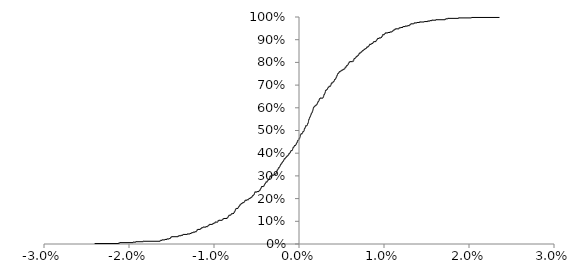
| Category | Series 0 |
|---|---|
| -0.024045713934551387 | 0.002 |
| -0.021190329641883797 | 0.004 |
| -0.021068445774304955 | 0.006 |
| -0.019481577920614893 | 0.008 |
| -0.01918932747459113 | 0.01 |
| -0.01831322585424418 | 0.012 |
| -0.016332640425425756 | 0.014 |
| -0.016269969586518905 | 0.016 |
| -0.01608391495394457 | 0.018 |
| -0.015775249893956705 | 0.02 |
| -0.01551416282012102 | 0.022 |
| -0.015269735575366317 | 0.024 |
| -0.015107295295219942 | 0.026 |
| -0.01510614566841752 | 0.028 |
| -0.015041004402000938 | 0.03 |
| -0.014970447727884563 | 0.032 |
| -0.014224533649371965 | 0.034 |
| -0.014128837425512858 | 0.036 |
| -0.013870625183525734 | 0.038 |
| -0.013659979136269044 | 0.04 |
| -0.013622299642461524 | 0.042 |
| -0.013101706478943017 | 0.044 |
| -0.012830034572842656 | 0.046 |
| -0.01267176406882256 | 0.048 |
| -0.012566487625169893 | 0.05 |
| -0.01239524316375942 | 0.052 |
| -0.012210900198019658 | 0.054 |
| -0.012037461029308916 | 0.056 |
| -0.012019648051448523 | 0.058 |
| -0.011996716287631437 | 0.06 |
| -0.01197246672821949 | 0.062 |
| -0.011894530173388951 | 0.064 |
| -0.01159521725666741 | 0.066 |
| -0.011517896520486468 | 0.068 |
| -0.011472401162236696 | 0.07 |
| -0.011367697100219972 | 0.072 |
| -0.011249528949107652 | 0.074 |
| -0.01094581856639011 | 0.076 |
| -0.010726428311408964 | 0.078 |
| -0.01069142597548092 | 0.08 |
| -0.010644946457490995 | 0.082 |
| -0.010538986044773935 | 0.084 |
| -0.010514023884936914 | 0.086 |
| -0.01015382338334644 | 0.088 |
| -0.01008261276841658 | 0.09 |
| -0.009987598628348417 | 0.092 |
| -0.009844718796764856 | 0.094 |
| -0.009835236504966026 | 0.096 |
| -0.009539280097896391 | 0.098 |
| -0.009533659771738095 | 0.1 |
| -0.009514123288645846 | 0.102 |
| -0.009398497993830787 | 0.104 |
| -0.009026859602507814 | 0.106 |
| -0.008947764498812849 | 0.108 |
| -0.008925364686319017 | 0.11 |
| -0.008852735163293964 | 0.112 |
| -0.008453012512976503 | 0.114 |
| -0.008375827121537857 | 0.116 |
| -0.00835670759098 | 0.118 |
| -0.008310936640576671 | 0.12 |
| -0.008276324422049015 | 0.122 |
| -0.008259633977417033 | 0.124 |
| -0.008212231260027627 | 0.127 |
| -0.008033855079448484 | 0.129 |
| -0.007967587195760756 | 0.131 |
| -0.007942280016678828 | 0.133 |
| -0.007825301090429157 | 0.135 |
| -0.007644462256945859 | 0.137 |
| -0.007637943779572475 | 0.139 |
| -0.007619906037600233 | 0.141 |
| -0.007556351894011646 | 0.143 |
| -0.0075268801302346856 | 0.145 |
| -0.007515170015972768 | 0.147 |
| -0.00748730661607019 | 0.149 |
| -0.007481767585666709 | 0.151 |
| -0.00744044968032026 | 0.153 |
| -0.007411444409454522 | 0.155 |
| -0.007378594656862036 | 0.157 |
| -0.007165841618811403 | 0.159 |
| -0.007128548356520289 | 0.161 |
| -0.00712000159865905 | 0.163 |
| -0.007057290933495905 | 0.165 |
| -0.007026629613306052 | 0.167 |
| -0.0069839491276426175 | 0.169 |
| -0.006968158168866895 | 0.171 |
| -0.006922378445205133 | 0.173 |
| -0.00682544739877283 | 0.175 |
| -0.006812678417506931 | 0.177 |
| -0.006772699622025403 | 0.179 |
| -0.00664705219507894 | 0.181 |
| -0.006553448937558107 | 0.183 |
| -0.006443927739273188 | 0.185 |
| -0.006398241453084545 | 0.187 |
| -0.006369448285479823 | 0.189 |
| -0.006362862475670971 | 0.191 |
| -0.006278815425240793 | 0.193 |
| -0.0061040717600700685 | 0.195 |
| -0.005925832140180678 | 0.197 |
| -0.005877206552038223 | 0.199 |
| -0.00586466082526631 | 0.201 |
| -0.0057103772938601124 | 0.203 |
| -0.005630478647285601 | 0.205 |
| -0.00556467495323499 | 0.207 |
| -0.005494950634617622 | 0.209 |
| -0.005464079770578731 | 0.211 |
| -0.00545703946305809 | 0.213 |
| -0.0053639404478179826 | 0.215 |
| -0.005293745819596694 | 0.217 |
| -0.005281436752107991 | 0.219 |
| -0.005241440827537501 | 0.221 |
| -0.00523326553213398 | 0.223 |
| -0.005211835191131121 | 0.225 |
| -0.005191643971182204 | 0.227 |
| -0.005176076178702757 | 0.229 |
| -0.004928683053494468 | 0.231 |
| -0.004698412567683171 | 0.233 |
| -0.004665584174377281 | 0.235 |
| -0.004642011430260426 | 0.237 |
| -0.004529698452133302 | 0.239 |
| -0.004521160236437266 | 0.241 |
| -0.004499530946937088 | 0.243 |
| -0.0044926489198649465 | 0.245 |
| -0.0044472312891333235 | 0.247 |
| -0.004420594505396591 | 0.249 |
| -0.004401185725108799 | 0.251 |
| -0.004388958993891964 | 0.253 |
| -0.004150978364038313 | 0.255 |
| -0.0040881274288376394 | 0.257 |
| -0.004080650265993606 | 0.259 |
| -0.004059597318226561 | 0.261 |
| -0.004033104694990438 | 0.263 |
| -0.003999433984110708 | 0.265 |
| -0.003943222775039928 | 0.267 |
| -0.003900394983748493 | 0.269 |
| -0.0038954883703021946 | 0.271 |
| -0.003876415753660303 | 0.273 |
| -0.0037249894468695515 | 0.275 |
| -0.003724399090982328 | 0.277 |
| -0.003653528192499786 | 0.279 |
| -0.0036297680505787237 | 0.281 |
| -0.0036141896129398697 | 0.283 |
| -0.0035361757785579047 | 0.285 |
| -0.003484577028609587 | 0.287 |
| -0.0034651857580575325 | 0.289 |
| -0.0034447642064368263 | 0.291 |
| -0.0034229676292277856 | 0.293 |
| -0.0034171378137580186 | 0.295 |
| -0.0034097399961143487 | 0.297 |
| -0.0033744548536642025 | 0.299 |
| -0.003156387125551505 | 0.301 |
| -0.0031174128991025107 | 0.303 |
| -0.002924088306537739 | 0.305 |
| -0.0029197101033346393 | 0.307 |
| -0.002739626310919094 | 0.309 |
| -0.0026656809565022152 | 0.311 |
| -0.0026520461374158217 | 0.313 |
| -0.002647151966236099 | 0.315 |
| -0.002625889676913249 | 0.317 |
| -0.002611796917580481 | 0.319 |
| -0.0026027726551484213 | 0.321 |
| -0.002570427619707821 | 0.323 |
| -0.002564402850716412 | 0.325 |
| -0.0024960146079363475 | 0.327 |
| -0.002472003955557073 | 0.329 |
| -0.002439280576675395 | 0.331 |
| -0.002420722557067953 | 0.333 |
| -0.002414989683048338 | 0.335 |
| -0.0022965638203714996 | 0.337 |
| -0.002266106505521522 | 0.339 |
| -0.0022454828166792893 | 0.341 |
| -0.0022278339824825955 | 0.343 |
| -0.0022202665783531915 | 0.345 |
| -0.0021754903431396777 | 0.347 |
| -0.0021685154173005225 | 0.349 |
| -0.002135992268149422 | 0.351 |
| -0.00204933102535561 | 0.353 |
| -0.0020462780633072972 | 0.355 |
| -0.0020110615123795587 | 0.357 |
| -0.0019409405788333308 | 0.359 |
| -0.0019065782705815315 | 0.361 |
| -0.0019002715363916139 | 0.363 |
| -0.0018371966727764775 | 0.365 |
| -0.0018158965738608902 | 0.367 |
| -0.0017858597164577491 | 0.369 |
| -0.0017377406798825168 | 0.371 |
| -0.001736177073215958 | 0.373 |
| -0.0017167386190544741 | 0.376 |
| -0.0015809143850267168 | 0.378 |
| -0.0015693311145910259 | 0.38 |
| -0.0015458342852584064 | 0.382 |
| -0.0014747547982762441 | 0.384 |
| -0.001434834841620336 | 0.386 |
| -0.001392273110386857 | 0.388 |
| -0.0013028374743831621 | 0.39 |
| -0.0012612330223037143 | 0.392 |
| -0.001216637668132483 | 0.394 |
| -0.0012115706464639353 | 0.396 |
| -0.0011770816661120004 | 0.398 |
| -0.0010644715904178164 | 0.4 |
| -0.0010582811479793533 | 0.402 |
| -0.0010519988947363071 | 0.404 |
| -0.0009904259640922987 | 0.406 |
| -0.0009762325710546765 | 0.408 |
| -0.0009451158470342428 | 0.41 |
| -0.0009066868773768128 | 0.412 |
| -0.0007729170271939847 | 0.414 |
| -0.0007558579347014359 | 0.416 |
| -0.0007308339139880837 | 0.418 |
| -0.0007255314836149191 | 0.42 |
| -0.000708365829719556 | 0.422 |
| -0.0007030371493170677 | 0.424 |
| -0.0006715165333482467 | 0.426 |
| -0.0006052353036925385 | 0.428 |
| -0.0005402276805126638 | 0.43 |
| -0.0005366246439479647 | 0.432 |
| -0.0005256636624630836 | 0.434 |
| -0.00037460198977105473 | 0.436 |
| -0.0003590535387394118 | 0.438 |
| -0.00034389078367716154 | 0.44 |
| -0.00029722098598961597 | 0.442 |
| -0.000296956201142778 | 0.444 |
| -0.00022901637567171953 | 0.446 |
| -0.0002158040507603174 | 0.448 |
| -0.00020234040469660936 | 0.45 |
| -0.00015082956288023036 | 0.452 |
| -0.0001466383168550864 | 0.454 |
| -0.00014623089884941757 | 0.456 |
| -8.073957454629162e-05 | 0.458 |
| 0.0 | 0.462 |
| 0.0 | 0.462 |
| 6.961606741656596e-05 | 0.464 |
| 7.462408122571185e-05 | 0.466 |
| 7.69615577401312e-05 | 0.468 |
| 0.00013489815209976878 | 0.47 |
| 0.0001349163520665318 | 0.472 |
| 0.00014383315378988044 | 0.474 |
| 0.0001502178161153388 | 0.476 |
| 0.00015330369491923598 | 0.478 |
| 0.0001539171928544822 | 0.48 |
| 0.00022482856916374133 | 0.482 |
| 0.00022892899485690697 | 0.484 |
| 0.00028129395403470877 | 0.486 |
| 0.0004175888480944361 | 0.488 |
| 0.0004287858280517676 | 0.49 |
| 0.00043623673805071256 | 0.492 |
| 0.0004579803148516746 | 0.494 |
| 0.0005135918525161227 | 0.496 |
| 0.0006095702718466799 | 0.498 |
| 0.0006098955742915254 | 0.5 |
| 0.0006128389957393166 | 0.502 |
| 0.0006183229903983234 | 0.504 |
| 0.0006319559245533333 | 0.506 |
| 0.0006533338405235578 | 0.508 |
| 0.0006714163406391752 | 0.51 |
| 0.0007511455322004172 | 0.512 |
| 0.000761382707711814 | 0.514 |
| 0.0007691124821523405 | 0.516 |
| 0.0007723905871482055 | 0.518 |
| 0.000789690984719016 | 0.52 |
| 0.0009187658559168035 | 0.522 |
| 0.000988630826939435 | 0.524 |
| 0.0009919500260166143 | 0.526 |
| 0.0010031528499595502 | 0.528 |
| 0.0010345185239343177 | 0.53 |
| 0.001062435911106988 | 0.532 |
| 0.0010963196086324347 | 0.534 |
| 0.0011084720058191367 | 0.536 |
| 0.0011114817194056376 | 0.538 |
| 0.001115034495753744 | 0.54 |
| 0.0011309020147903775 | 0.542 |
| 0.0011328878519914684 | 0.544 |
| 0.0011481057518319265 | 0.546 |
| 0.001164229193570625 | 0.548 |
| 0.001198412247391334 | 0.55 |
| 0.0012262417232442935 | 0.552 |
| 0.0012403102365240927 | 0.554 |
| 0.001243190039086504 | 0.556 |
| 0.0012879223302888338 | 0.558 |
| 0.0013260647294585776 | 0.56 |
| 0.001326622380368351 | 0.562 |
| 0.0013728722639549371 | 0.564 |
| 0.001387540114387432 | 0.566 |
| 0.001405273704874667 | 0.568 |
| 0.0014137608386803567 | 0.57 |
| 0.0014206790076948539 | 0.572 |
| 0.0014607072419009868 | 0.574 |
| 0.0015160915315262523 | 0.576 |
| 0.0015253316921456557 | 0.578 |
| 0.0015305567653917241 | 0.58 |
| 0.0015736770057350133 | 0.582 |
| 0.0016125939374775885 | 0.584 |
| 0.0016206887950095197 | 0.586 |
| 0.00162337697989077 | 0.588 |
| 0.0016345214492289979 | 0.59 |
| 0.0016637785467117667 | 0.592 |
| 0.0016661621546130057 | 0.594 |
| 0.001679496545935451 | 0.596 |
| 0.0016975312718331044 | 0.598 |
| 0.0016987109327697843 | 0.6 |
| 0.0017546429417708653 | 0.602 |
| 0.0017943930048368569 | 0.604 |
| 0.0018216323822913085 | 0.606 |
| 0.0019150979360996131 | 0.608 |
| 0.001959159695300315 | 0.61 |
| 0.0020233061719043912 | 0.612 |
| 0.0021155418793288895 | 0.614 |
| 0.002132563667220828 | 0.616 |
| 0.0021492178982183505 | 0.618 |
| 0.0021904214365408283 | 0.62 |
| 0.0021968374388719905 | 0.622 |
| 0.0022132646770947123 | 0.624 |
| 0.0022629243798555324 | 0.627 |
| 0.0022759820404469147 | 0.629 |
| 0.002364306839869615 | 0.631 |
| 0.002366695263271379 | 0.633 |
| 0.002368393829658272 | 0.635 |
| 0.002385258700247559 | 0.637 |
| 0.0024189292919533554 | 0.639 |
| 0.002446671455249032 | 0.641 |
| 0.002531446648887791 | 0.643 |
| 0.002818297938858711 | 0.645 |
| 0.0028477298444240747 | 0.647 |
| 0.002893284410108221 | 0.649 |
| 0.0029057720736325255 | 0.651 |
| 0.002919507148083122 | 0.653 |
| 0.0029280399311989243 | 0.655 |
| 0.0029439927055498615 | 0.657 |
| 0.002949520005590317 | 0.659 |
| 0.003013710980316292 | 0.661 |
| 0.003046228842563035 | 0.663 |
| 0.003057562733278919 | 0.665 |
| 0.0030707476592136 | 0.667 |
| 0.0030875566687874586 | 0.669 |
| 0.003109501283888956 | 0.671 |
| 0.003111282628706358 | 0.673 |
| 0.00311350378887023 | 0.675 |
| 0.0031379684756924447 | 0.677 |
| 0.0032391315064568852 | 0.679 |
| 0.003292923197045109 | 0.681 |
| 0.0033476836620790597 | 0.683 |
| 0.003367992640425312 | 0.685 |
| 0.0034061033084821024 | 0.687 |
| 0.0034252848414956516 | 0.689 |
| 0.0034508291577329936 | 0.691 |
| 0.0035567089470518757 | 0.693 |
| 0.0035578182383089792 | 0.695 |
| 0.0037295016018431527 | 0.697 |
| 0.0037534993702616113 | 0.699 |
| 0.0037664827954768648 | 0.701 |
| 0.0037685527838538487 | 0.703 |
| 0.003787022627918043 | 0.705 |
| 0.003798274243580003 | 0.707 |
| 0.003835944508903044 | 0.709 |
| 0.003957266739201925 | 0.711 |
| 0.003992311040660261 | 0.713 |
| 0.004053810600304886 | 0.715 |
| 0.004101462846157038 | 0.717 |
| 0.004163676101105638 | 0.719 |
| 0.004176739211487572 | 0.721 |
| 0.004180104566951662 | 0.723 |
| 0.004201991258482965 | 0.725 |
| 0.004293513546187116 | 0.727 |
| 0.004342351689503505 | 0.729 |
| 0.004352563998842161 | 0.731 |
| 0.0043745512944927505 | 0.733 |
| 0.004386735440453227 | 0.735 |
| 0.004442414667628127 | 0.737 |
| 0.004448862613098888 | 0.739 |
| 0.00445539487161849 | 0.741 |
| 0.004493146880975134 | 0.743 |
| 0.004525367140849695 | 0.745 |
| 0.004543600234020249 | 0.747 |
| 0.0045663946845789114 | 0.749 |
| 0.00457919638009814 | 0.751 |
| 0.004651354517129646 | 0.753 |
| 0.004714904859415408 | 0.755 |
| 0.004745797991973606 | 0.757 |
| 0.004752394566630645 | 0.759 |
| 0.004886998119625673 | 0.761 |
| 0.00496720448961702 | 0.763 |
| 0.005010065872544744 | 0.765 |
| 0.005137457145532014 | 0.767 |
| 0.005214445973549821 | 0.769 |
| 0.005313912147545568 | 0.771 |
| 0.005421345040114918 | 0.773 |
| 0.005424649605271357 | 0.775 |
| 0.005432870337181786 | 0.777 |
| 0.00545539629236325 | 0.779 |
| 0.005585965475625796 | 0.781 |
| 0.005587214766808956 | 0.783 |
| 0.005599641323362964 | 0.785 |
| 0.005687633824525923 | 0.787 |
| 0.005764905703721064 | 0.789 |
| 0.0057840778223991005 | 0.791 |
| 0.005793071514288832 | 0.793 |
| 0.005845528127436188 | 0.795 |
| 0.005869142957716238 | 0.797 |
| 0.0058926810575089346 | 0.799 |
| 0.005914989519201744 | 0.801 |
| 0.006008664667023387 | 0.803 |
| 0.006316833443904053 | 0.805 |
| 0.006439992534389091 | 0.807 |
| 0.006440663433732712 | 0.809 |
| 0.006443716680744963 | 0.811 |
| 0.006459388539856154 | 0.813 |
| 0.006484375695030353 | 0.815 |
| 0.006519677935599003 | 0.817 |
| 0.006627719089187737 | 0.819 |
| 0.006698141647468513 | 0.821 |
| 0.0067214592109669825 | 0.823 |
| 0.006742545560829559 | 0.825 |
| 0.0068228943218896845 | 0.827 |
| 0.006916041717004771 | 0.829 |
| 0.006945858430849064 | 0.831 |
| 0.007028179317082712 | 0.833 |
| 0.007048550060634374 | 0.835 |
| 0.0070711254832391025 | 0.837 |
| 0.007084934218637229 | 0.839 |
| 0.007153837356618774 | 0.841 |
| 0.0072738500753521005 | 0.843 |
| 0.007304845703498331 | 0.845 |
| 0.007383705878034127 | 0.847 |
| 0.007436021636869434 | 0.849 |
| 0.007473446683941451 | 0.851 |
| 0.0075716965308935125 | 0.853 |
| 0.0076545723257060725 | 0.855 |
| 0.007668313634392583 | 0.857 |
| 0.007775598700839781 | 0.859 |
| 0.007854116052636253 | 0.861 |
| 0.007950941593343232 | 0.863 |
| 0.0079699175204881 | 0.865 |
| 0.007996488634226355 | 0.867 |
| 0.008131070468854192 | 0.869 |
| 0.008217648348034862 | 0.871 |
| 0.008229854029955205 | 0.873 |
| 0.008278004362099368 | 0.876 |
| 0.00831202402830491 | 0.878 |
| 0.008319576791989705 | 0.88 |
| 0.008510043000299995 | 0.882 |
| 0.008581854847939692 | 0.884 |
| 0.008695706967553913 | 0.886 |
| 0.008746306071960589 | 0.888 |
| 0.008758968734853755 | 0.89 |
| 0.00884393468529231 | 0.892 |
| 0.009070529813467294 | 0.894 |
| 0.009083273905515712 | 0.896 |
| 0.00914007193939798 | 0.898 |
| 0.009170432514086632 | 0.9 |
| 0.009205392689518699 | 0.902 |
| 0.00924297393819773 | 0.904 |
| 0.009275787307804578 | 0.906 |
| 0.00946224084209228 | 0.908 |
| 0.009641690596963678 | 0.91 |
| 0.009739156855134486 | 0.912 |
| 0.009751485046502343 | 0.914 |
| 0.009786675910457388 | 0.916 |
| 0.00983917684254715 | 0.918 |
| 0.009846137214639668 | 0.92 |
| 0.009853043180608574 | 0.922 |
| 0.010032868452038822 | 0.924 |
| 0.010100010645606457 | 0.926 |
| 0.010123688581959918 | 0.928 |
| 0.010197075610805545 | 0.93 |
| 0.010455222272227577 | 0.932 |
| 0.010725773179602008 | 0.934 |
| 0.01091969355956293 | 0.936 |
| 0.01101115876114314 | 0.938 |
| 0.011075127970142649 | 0.94 |
| 0.011118896571889074 | 0.942 |
| 0.011231156562052423 | 0.944 |
| 0.011277115148976814 | 0.946 |
| 0.011383478237782033 | 0.948 |
| 0.011771213729721846 | 0.95 |
| 0.011791867109254733 | 0.952 |
| 0.011950349686822652 | 0.954 |
| 0.012228699721730404 | 0.956 |
| 0.012258811194274681 | 0.958 |
| 0.012541970422878013 | 0.96 |
| 0.012787720299438454 | 0.962 |
| 0.013031306607521642 | 0.964 |
| 0.0130425903280919 | 0.966 |
| 0.013133537037762514 | 0.968 |
| 0.013195290418832642 | 0.97 |
| 0.013506034133948425 | 0.972 |
| 0.013602461138405957 | 0.974 |
| 0.013870625183525689 | 0.976 |
| 0.014215575404458487 | 0.978 |
| 0.014736447144141412 | 0.98 |
| 0.015162921957812076 | 0.982 |
| 0.015403993956423409 | 0.984 |
| 0.015653815086314322 | 0.986 |
| 0.016117450932492804 | 0.988 |
| 0.017194470719014587 | 0.99 |
| 0.017308358794599996 | 0.992 |
| 0.01751649165478374 | 0.994 |
| 0.018794485883447405 | 0.996 |
| 0.020291892723969016 | 0.998 |
| 0.02358752328284793 | 1 |